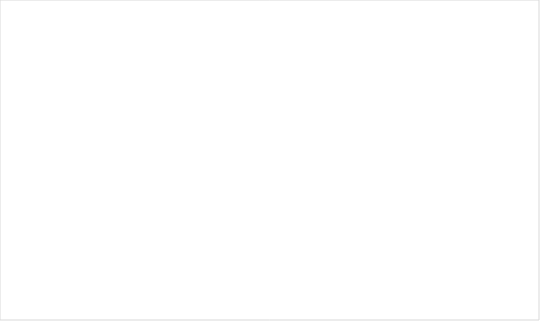
| Category | Total |
|---|---|
| Ja | 14 |
| Nej | 63 |